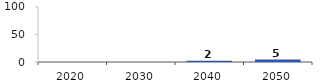
| Category | Exports | Imports | Net Flow |
|---|---|---|---|
| 2020.0 | 0 | 0 | 0 |
| 2030.0 | 0 | 0 | 0 |
| 2040.0 | 0 | 2.309 | 2.309 |
| 2050.0 | 0 | 4.536 | 4.536 |